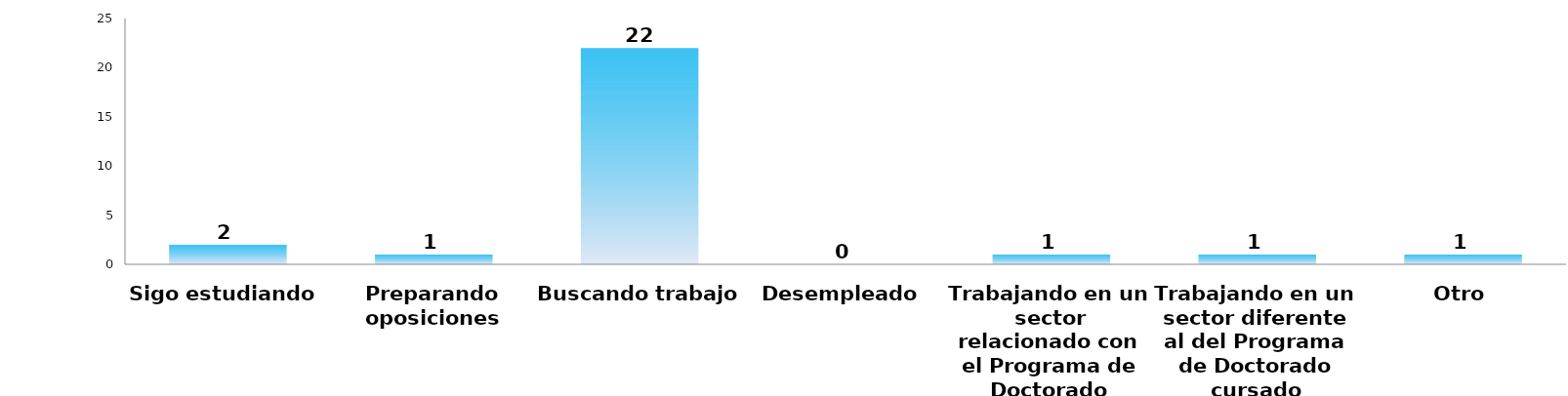
| Category | Series 0 |
|---|---|
| Sigo estudiando | 2 |
| Preparando oposiciones | 1 |
| Buscando trabajo | 22 |
| Desempleado | 0 |
| Trabajando en un sector relacionado con el Programa de Doctorado cursado | 1 |
| Trabajando en un sector diferente al del Programa de Doctorado cursado | 1 |
| Otro | 1 |